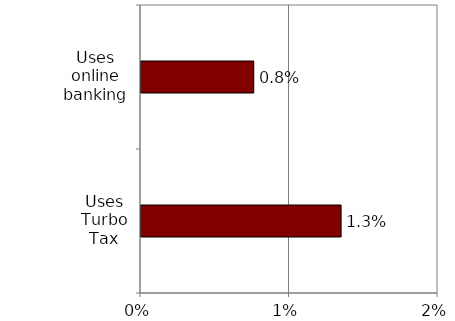
| Category | Series 0 |
|---|---|
| Uses Turbo Tax | 0.013 |
| Uses online banking | 0.008 |